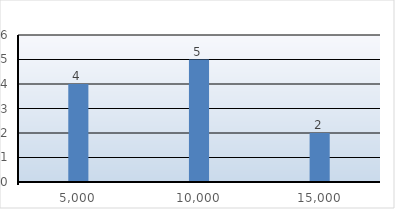
| Category | Vmax |
|---|---|
| 5000.0 | 4 |
| 10000.0 | 5 |
| 15000.0 | 2 |